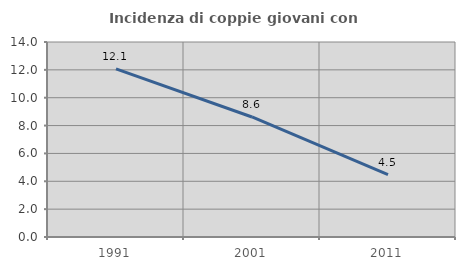
| Category | Incidenza di coppie giovani con figli |
|---|---|
| 1991.0 | 12.068 |
| 2001.0 | 8.617 |
| 2011.0 | 4.486 |